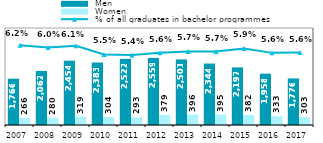
| Category |  Men |  Women |
|---|---|---|
| 2007.0 | 1766 | 266 |
| 2008.0 | 2062 | 280 |
| 2009.0 | 2454 | 319 |
| 2010.0 | 2383 | 304 |
| 2011.0 | 2522 | 293 |
| 2012.0 | 2559 | 379 |
| 2013.0 | 2501 | 396 |
| 2014.0 | 2344 | 395 |
| 2015.0 | 2197 | 382 |
| 2016.0 | 1958 | 333 |
| 2017.0 | 1776 | 303 |